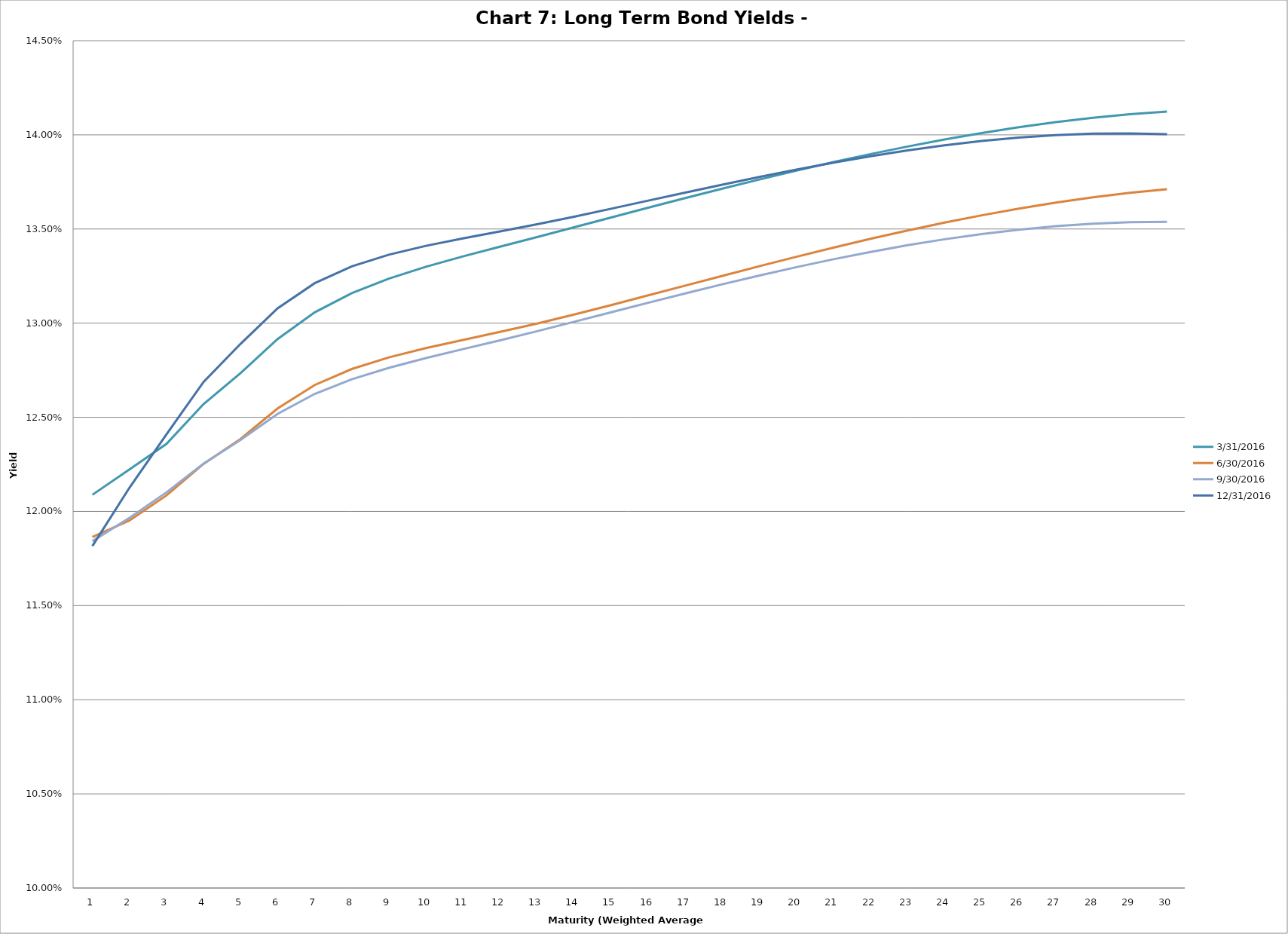
| Category | 3/31/2016 | 6/30/2016 | 9/30/2016 | 12/31/2016 |
|---|---|---|---|---|
| 0 | 0.121 | 0.119 | 0.118 | 0.118 |
| 1 | 0.122 | 0.12 | 0.12 | 0.121 |
| 2 | 0.124 | 0.121 | 0.121 | 0.124 |
| 3 | 0.126 | 0.123 | 0.123 | 0.127 |
| 4 | 0.127 | 0.124 | 0.124 | 0.129 |
| 5 | 0.129 | 0.125 | 0.125 | 0.131 |
| 6 | 0.131 | 0.127 | 0.126 | 0.132 |
| 7 | 0.132 | 0.128 | 0.127 | 0.133 |
| 8 | 0.132 | 0.128 | 0.128 | 0.134 |
| 9 | 0.133 | 0.129 | 0.128 | 0.134 |
| 10 | 0.134 | 0.129 | 0.129 | 0.134 |
| 11 | 0.134 | 0.13 | 0.129 | 0.135 |
| 12 | 0.135 | 0.13 | 0.13 | 0.135 |
| 13 | 0.135 | 0.13 | 0.13 | 0.136 |
| 14 | 0.136 | 0.131 | 0.131 | 0.136 |
| 15 | 0.136 | 0.131 | 0.131 | 0.137 |
| 16 | 0.137 | 0.132 | 0.132 | 0.137 |
| 17 | 0.137 | 0.133 | 0.132 | 0.137 |
| 18 | 0.138 | 0.133 | 0.133 | 0.138 |
| 19 | 0.138 | 0.134 | 0.133 | 0.138 |
| 20 | 0.139 | 0.134 | 0.133 | 0.139 |
| 21 | 0.139 | 0.134 | 0.134 | 0.139 |
| 22 | 0.139 | 0.135 | 0.134 | 0.139 |
| 23 | 0.14 | 0.135 | 0.134 | 0.139 |
| 24 | 0.14 | 0.136 | 0.135 | 0.14 |
| 25 | 0.14 | 0.136 | 0.135 | 0.14 |
| 26 | 0.141 | 0.136 | 0.135 | 0.14 |
| 27 | 0.141 | 0.137 | 0.135 | 0.14 |
| 28 | 0.141 | 0.137 | 0.135 | 0.14 |
| 29 | 0.141 | 0.137 | 0.135 | 0.14 |